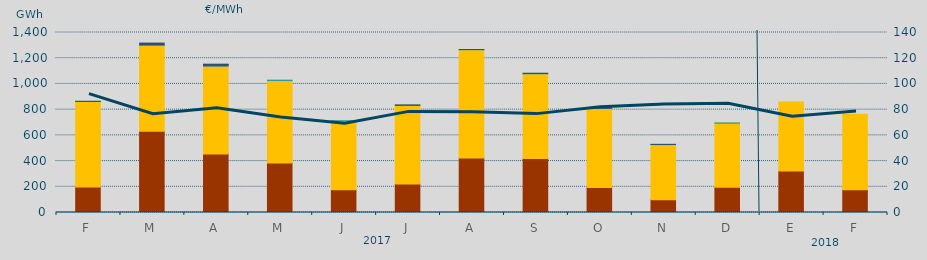
| Category | Carbón | Ciclo Combinado | Hidráulica | Nuclear | Consumo Bombeo |
|---|---|---|---|---|---|
| F | 198516.2 | 665095.2 | 712.6 | 0 | 139.6 |
| M | 631868 | 670791.6 | 1411.7 | 0 | 13667.9 |
| A | 454829.4 | 684899.6 | 1412 | 9600 | 2812.1 |
| M | 384999.4 | 642959.4 | 538 | 0 | 0 |
| J | 176734.4 | 535700.2 | 240 | 0 | 0 |
| J | 221645.5 | 612390.3 | 245 | 0 | 1709.9 |
| A | 424631 | 842008.2 | 714.3 | 0 | 227.4 |
| S | 419522.2 | 659557.1 | 1903.2 | 0 | 2247.5 |
| O | 195163.5 | 613794.4 | 1865.1 | 0 | 2877.8 |
| N | 99779.8 | 428275.6 | 1458.4 | 0 | 370 |
| D | 195559 | 499810.1 | 237.7 | 0 | 0 |
| E | 323414.2 | 535924.4 | 0 | 0 | 0 |
| F | 176086.6 | 587965.4 | 0 | 0 | 0 |